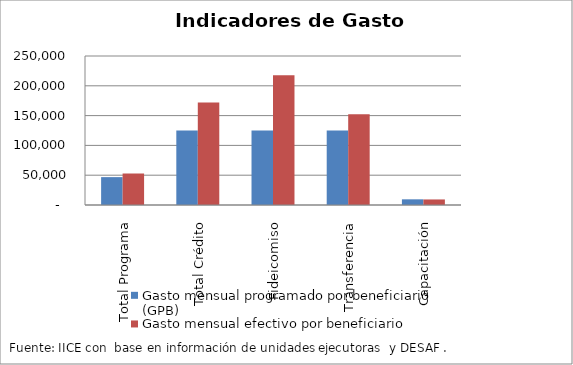
| Category | Gasto mensual programado por beneficiario (GPB)  | Gasto mensual efectivo por beneficiario (GEB)  |
|---|---|---|
| Total Programa | 46764.099 | 52854.574 |
| Total Crédito | 125000 | 171894.223 |
| Fideicomiso | 125000 | 217550.627 |
| Transferencia | 125000 | 152461.52 |
| Capacitación | 9523.81 | 9306.893 |